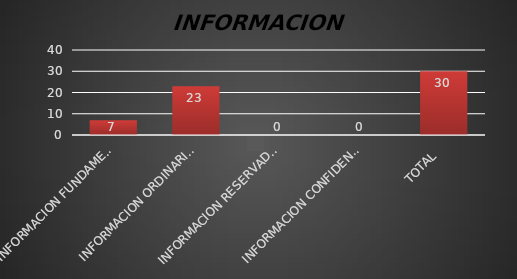
| Category | Series 1 |
|---|---|
| INFORMACION FUNDAMENTAL  | 7 |
| INFORMACION ORDINARIA  | 23 |
| INFORMACION RESERVADA  | 0 |
| INFORMACION CONFIDENCIAL  | 0 |
| TOTAL  | 30 |